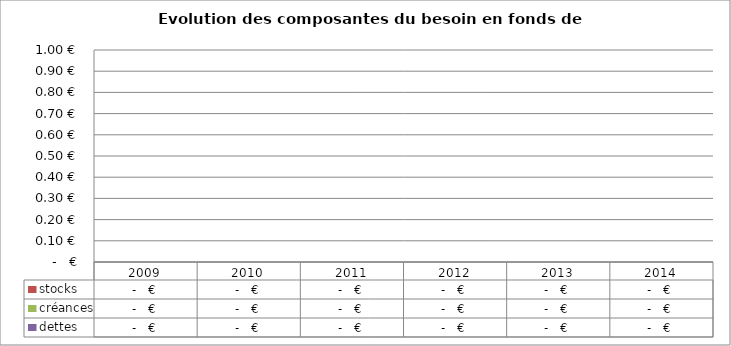
| Category | stocks | créances | dettes |
|---|---|---|---|
| 2009.0 | 0 | 0 | 0 |
| 2010.0 | 0 | 0 | 0 |
| 2011.0 | 0 | 0 | 0 |
| 2012.0 | 0 | 0 | 0 |
| 2013.0 | 0 | 0 | 0 |
| 2014.0 | 0 | 0 | 0 |